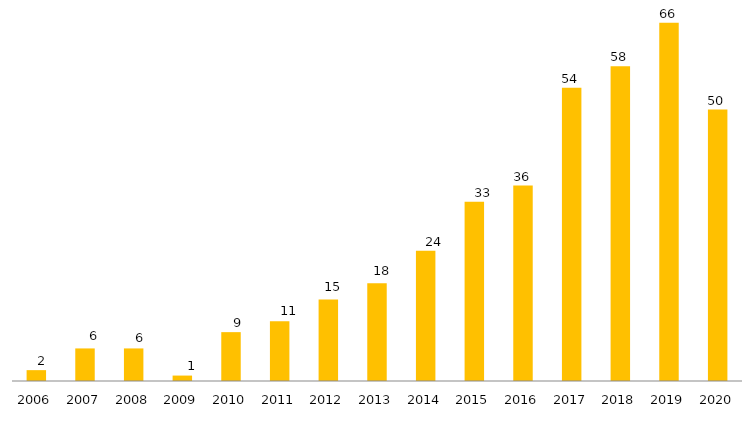
| Category | Programa |
|---|---|
| 2006.0 | 2 |
| 2007.0 | 6 |
| 2008.0 | 6 |
| 2009.0 | 1 |
| 2010.0 | 9 |
| 2011.0 | 11 |
| 2012.0 | 15 |
| 2013.0 | 18 |
| 2014.0 | 24 |
| 2015.0 | 33 |
| 2016.0 | 36 |
| 2017.0 | 54 |
| 2018.0 | 58 |
| 2019.0 | 66 |
| 2020.0 | 50 |